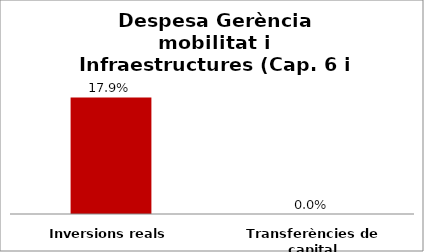
| Category | Series 0 |
|---|---|
| Inversions reals | 0.179 |
| Transferències de capital | 0 |